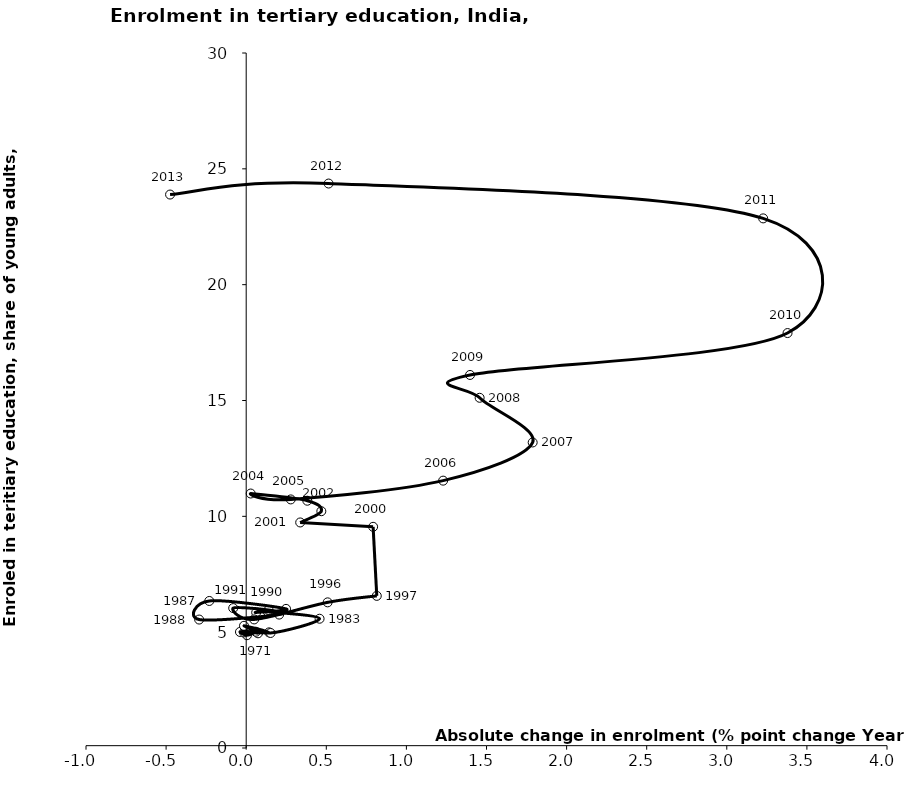
| Category | Series 0 |
|---|---|
| 0.07372045516966974 | 4.951 |
| 0.011730003356931995 | 5.025 |
| -0.038940072059630015 | 5.01 |
| 0.00473999977111994 | 4.869 |
| 0.06041502952575506 | 5.019 |
| -0.0135498046875 | 4.99 |
| 0.14271497726440519 | 4.992 |
| -0.013674974441530097 | 5.275 |
| 0.15229511260986506 | 4.965 |
| 0.45800495147705034 | 5.58 |
| 0.134835004806515 | 5.881 |
| 0.06230998039246005 | 5.85 |
| 0.24866986274719505 | 6.005 |
| -0.23036003112793013 | 6.347 |
| -0.2937049865722652 | 5.545 |
| 0.20576500892638983 | 5.759 |
| 0.13969993591308505 | 5.956 |
| -0.08116397857665998 | 6.039 |
| 0.04964199066162003 | 5.55 |
| 0.5083148479461652 | 6.287 |
| 0.8150974512100226 | 6.567 |
| 0.7922126054763798 | 9.547 |
| 0.3370051383971946 | 9.736 |
| 0.4690146446228054 | 10.221 |
| 0.38141489028935016 | 10.674 |
| 0.028160095214849967 | 10.984 |
| 0.2781400680542001 | 10.73 |
| 1.2293052673339995 | 11.541 |
| 1.7882699966430495 | 13.189 |
| 1.457109451293901 | 15.117 |
| 1.3971948623657005 | 16.103 |
| 3.3791904449462997 | 17.911 |
| 3.2269201278686506 | 22.861 |
| 0.5143699645996005 | 24.365 |
| -0.4752197265625 | 23.89 |